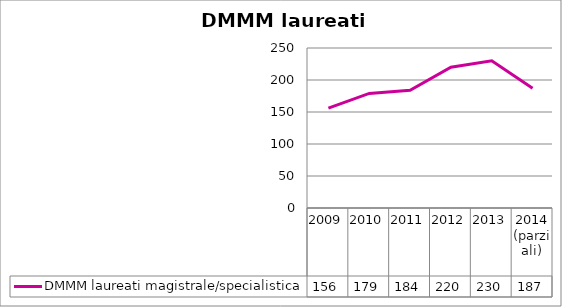
| Category | DMMM laureati magistrale/specialistica |
|---|---|
| 2009 | 156 |
| 2010 | 179 |
| 2011 | 184 |
| 2012 | 220 |
| 2013 | 230 |
| 2014
(parziali) | 187 |